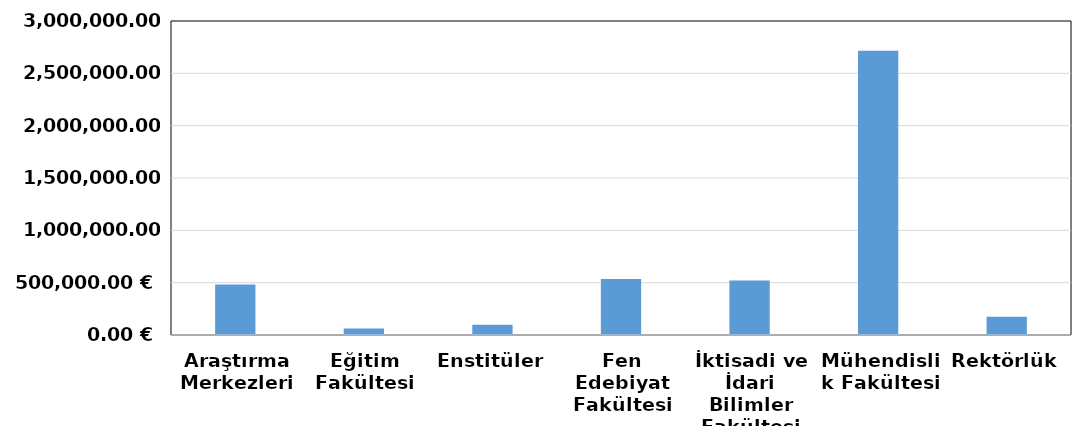
| Category | Total |
|---|---|
| Araştırma Merkezleri | 483250 |
| Eğitim Fakültesi | 63000 |
| Enstitüler | 98055 |
| Fen Edebiyat Fakültesi | 535918.5 |
| İktisadi ve İdari Bilimler Fakültesi | 521544.35 |
| Mühendislik Fakültesi | 2716577.96 |
| Rektörlük | 173250 |